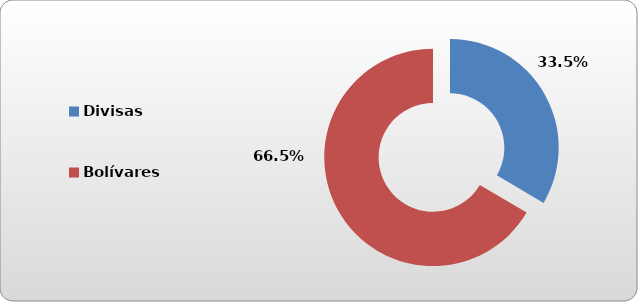
| Category | Divisas |
|---|---|
| Divisas | 48975.835 |
| Bolívares | 97285.813 |